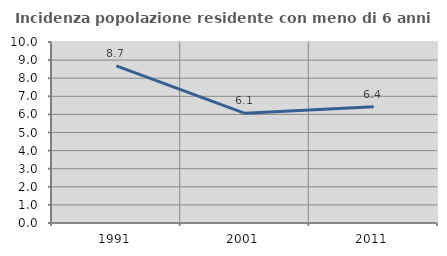
| Category | Incidenza popolazione residente con meno di 6 anni |
|---|---|
| 1991.0 | 8.68 |
| 2001.0 | 6.058 |
| 2011.0 | 6.427 |